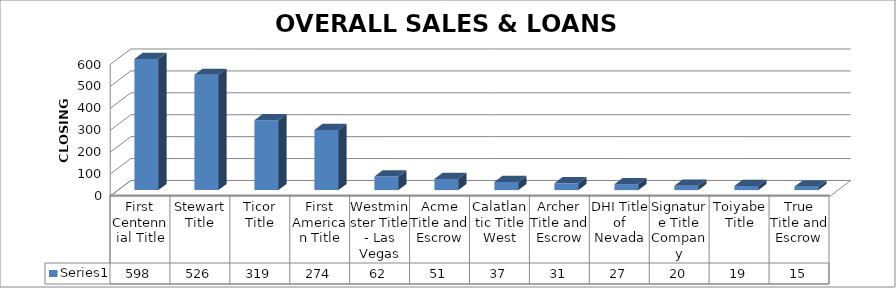
| Category | Series 0 |
|---|---|
| First Centennial Title | 598 |
| Stewart Title | 526 |
| Ticor Title | 319 |
| First American Title | 274 |
| Westminster Title - Las Vegas | 62 |
| Acme Title and Escrow | 51 |
| Calatlantic Title West | 37 |
| Archer Title and Escrow | 31 |
| DHI Title of Nevada | 27 |
| Signature Title Company | 20 |
| Toiyabe Title | 19 |
| True Title and Escrow | 15 |